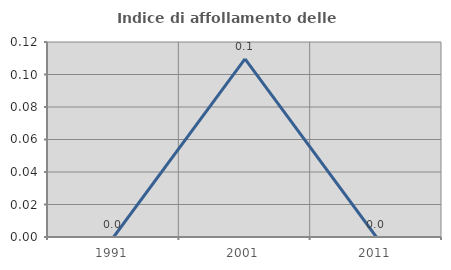
| Category | Indice di affollamento delle abitazioni  |
|---|---|
| 1991.0 | 0 |
| 2001.0 | 0.11 |
| 2011.0 | 0 |